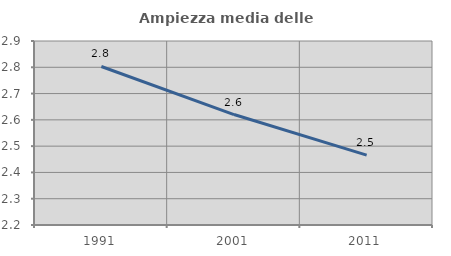
| Category | Ampiezza media delle famiglie |
|---|---|
| 1991.0 | 2.803 |
| 2001.0 | 2.62 |
| 2011.0 | 2.466 |